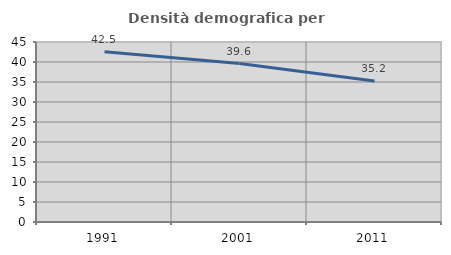
| Category | Densità demografica |
|---|---|
| 1991.0 | 42.538 |
| 2001.0 | 39.619 |
| 2011.0 | 35.24 |